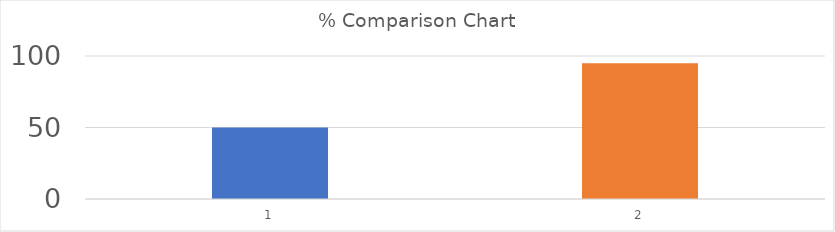
| Category | Series 0 |
|---|---|
| 0 | 50 |
| 1 | 95 |